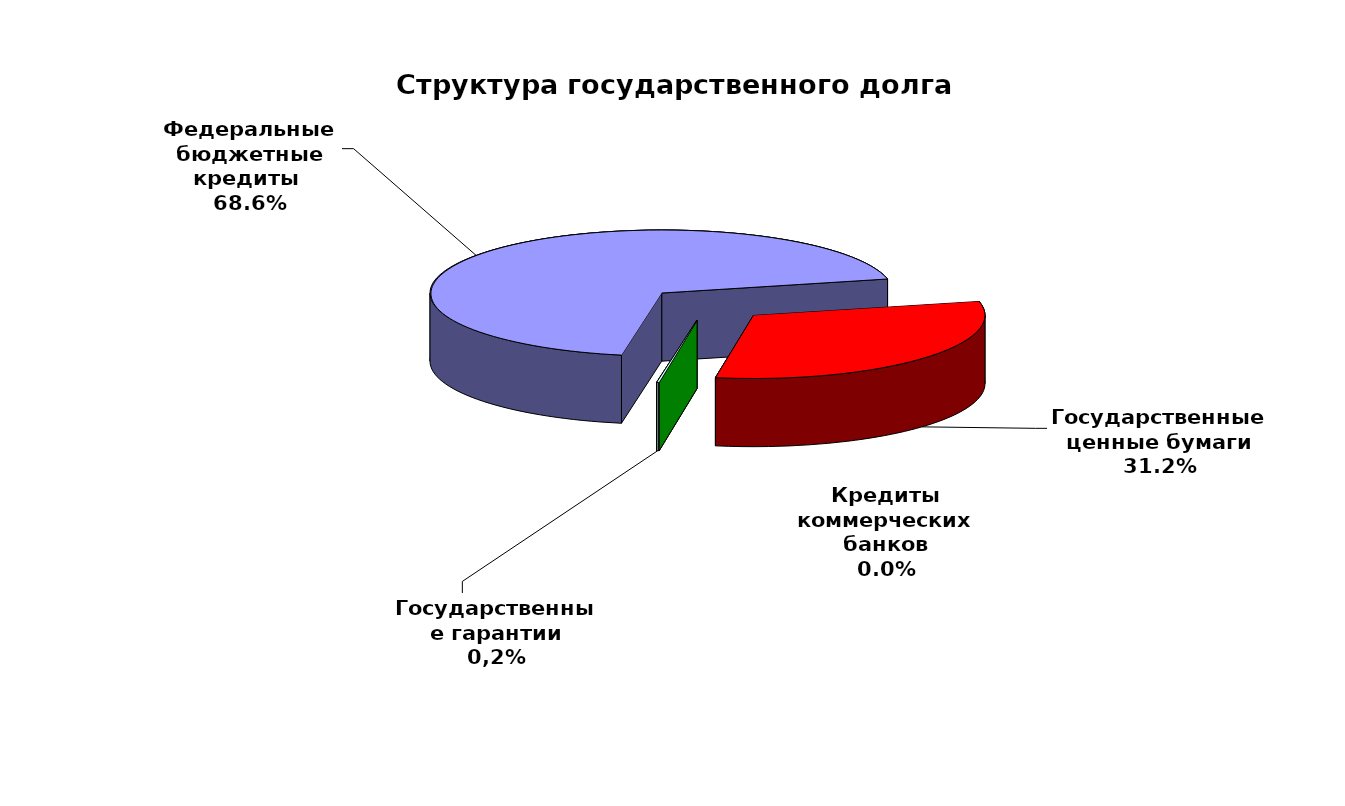
| Category | Series 0 |
|---|---|
| Федеральные бюджетные кредиты  | 91334953.061 |
| Государственные ценные бумаги | 41500000 |
| Кредиты коммерческих банков | 0 |
| Государственные гарантии | 216632.857 |